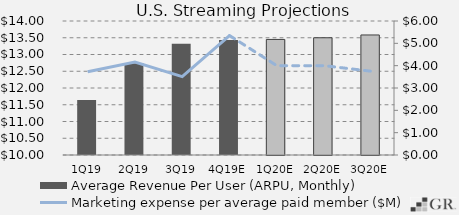
| Category | Average Revenue Per User (ARPU, Monthly) |
|---|---|
|  1Q19  | 11.644 |
|  2Q19  | 12.738 |
|  3Q19  | 13.323 |
|  4Q19E  | 13.433 |
|  1Q20E  | 13.45 |
|  2Q20E  | 13.5 |
|  3Q20E  | 13.583 |